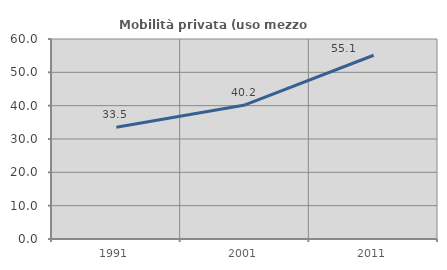
| Category | Mobilità privata (uso mezzo privato) |
|---|---|
| 1991.0 | 33.514 |
| 2001.0 | 40.226 |
| 2011.0 | 55.118 |